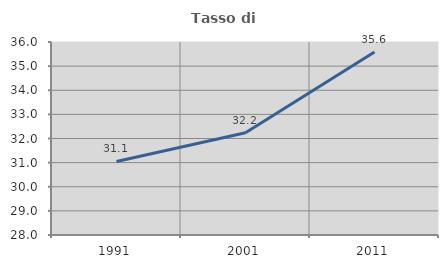
| Category | Tasso di occupazione   |
|---|---|
| 1991.0 | 31.05 |
| 2001.0 | 32.24 |
| 2011.0 | 35.583 |